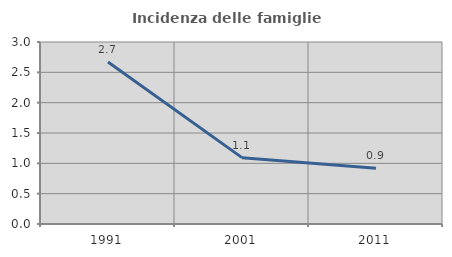
| Category | Incidenza delle famiglie numerose |
|---|---|
| 1991.0 | 2.671 |
| 2001.0 | 1.094 |
| 2011.0 | 0.92 |